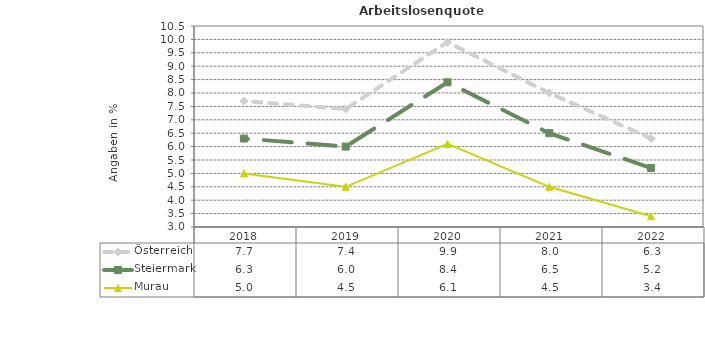
| Category | Österreich | Steiermark | Murau |
|---|---|---|---|
| 2022.0 | 6.3 | 5.2 | 3.4 |
| 2021.0 | 8 | 6.5 | 4.5 |
| 2020.0 | 9.9 | 8.4 | 6.1 |
| 2019.0 | 7.4 | 6 | 4.5 |
| 2018.0 | 7.7 | 6.3 | 5 |